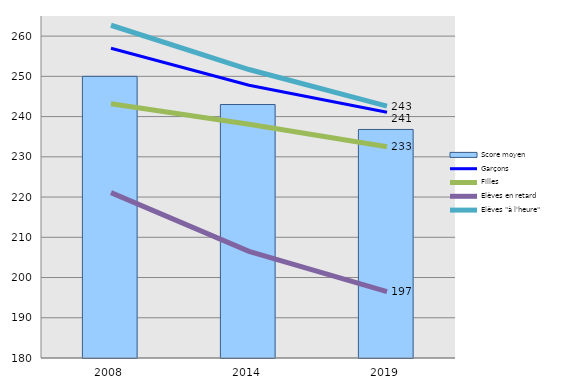
| Category | Score moyen |
|---|---|
| 2008.0 | 250 |
| 2014.0 | 243 |
| 2019.0 | 236.8 |